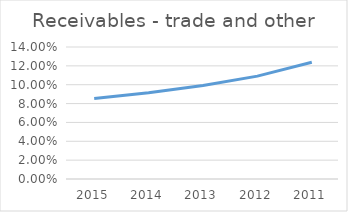
| Category | Receivables - trade and other |
|---|---|
| 2015.0 | 0.085 |
| 2014.0 | 0.091 |
| 2013.0 | 0.099 |
| 2012.0 | 0.109 |
| 2011.0 | 0.124 |